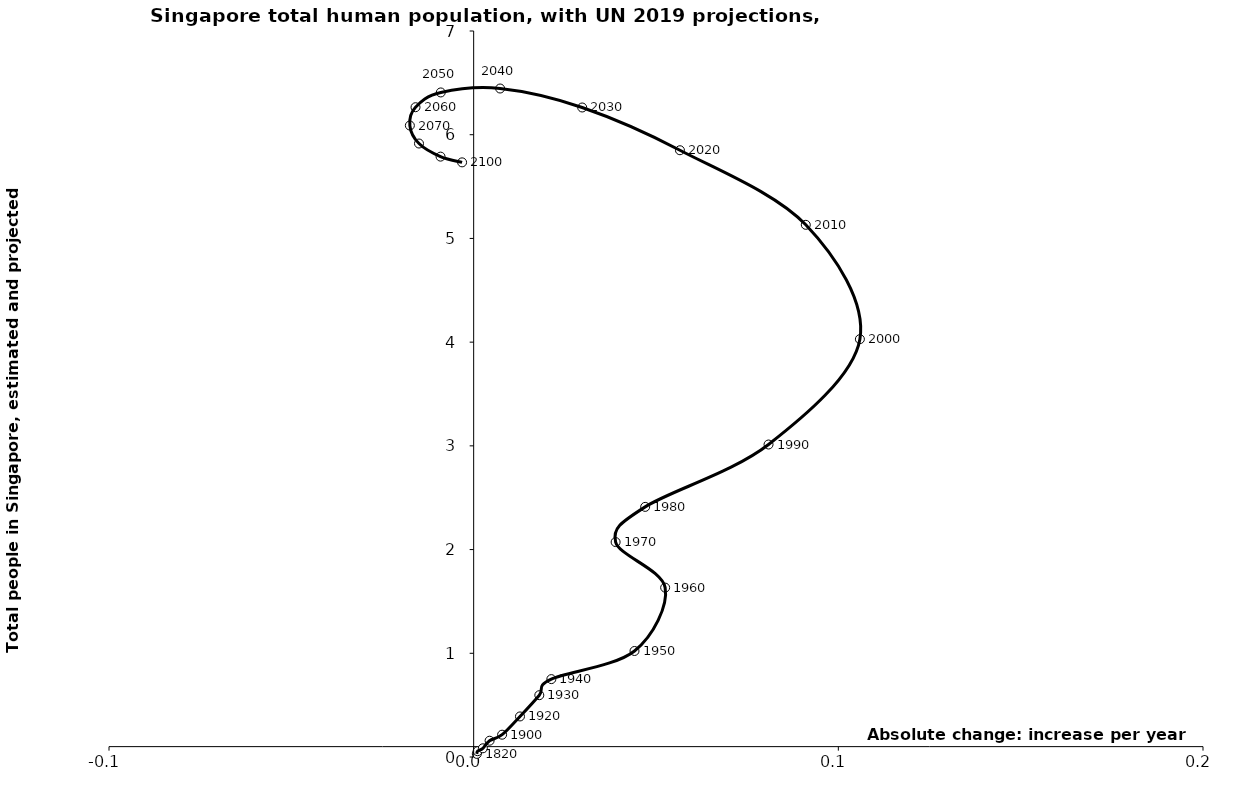
| Category | Series 0 |
|---|---|
| 0.0008666666666666667 | 0.03 |
| 0.0010800000000000002 | 0.056 |
| 0.0025250000000000003 | 0.084 |
| 0.004366666666666667 | 0.157 |
| 0.0078000000000000005 | 0.215 |
| 0.0127 | 0.391 |
| 0.018 | 0.596 |
| 0.02130480000000003 | 0.751 |
| 0.044106499999999986 | 1.022 |
| 0.052509349999999996 | 1.633 |
| 0.03892790000000011 | 2.072 |
| 0.047034149999999976 | 2.412 |
| 0.08085914999999992 | 3.013 |
| 0.10591029999999993 | 4.029 |
| 0.09107355000000009 | 5.131 |
| 0.056564700000000065 | 5.85 |
| 0.029757699999999866 | 6.262 |
| 0.007253299999999951 | 6.445 |
| -0.009021549999999979 | 6.408 |
| -0.01594624999999992 | 6.265 |
| -0.017496850000000074 | 6.089 |
| -0.01499129999999993 | 5.915 |
| -0.009082749999999829 | 5.789 |
| -0.003174199999999728 | 5.733 |